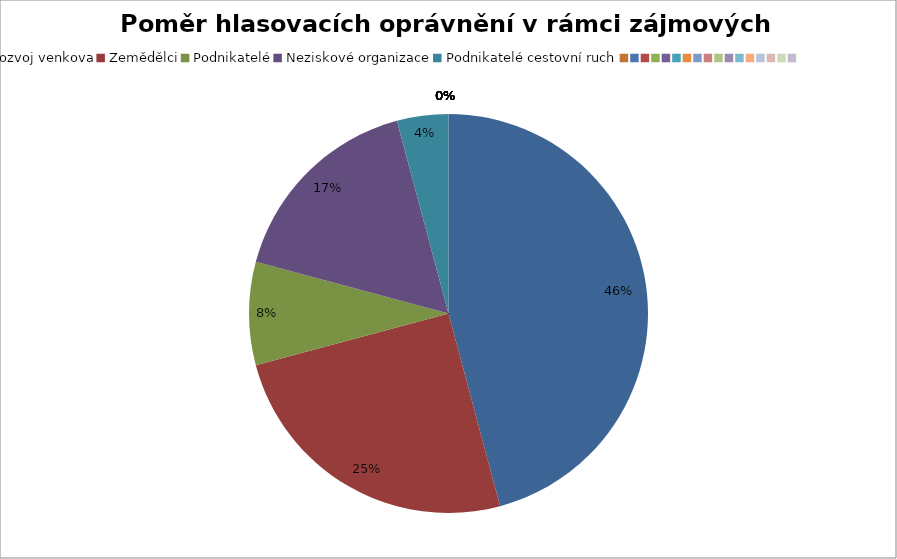
| Category | Series 0 |
|---|---|
| Rozvoj venkova | 0.458 |
| Zemědělci | 0.25 |
| Podnikatelé | 0.083 |
| Neziskové organizace | 0.167 |
| Podnikatelé cestovní ruch | 0.042 |